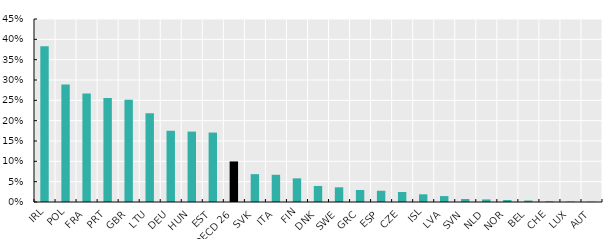
| Category | Share missing responses to mental health questions |
|---|---|
| IRL | 0.383 |
| POL | 0.289 |
| FRA | 0.267 |
| PRT | 0.256 |
| GBR | 0.251 |
| LTU | 0.218 |
| DEU | 0.175 |
| HUN | 0.173 |
| EST | 0.171 |
| OECD 26 | 0.1 |
| SVK | 0.069 |
| ITA | 0.067 |
| FIN | 0.058 |
| DNK | 0.039 |
| SWE | 0.036 |
| GRC | 0.03 |
| ESP | 0.028 |
| CZE | 0.025 |
| ISL | 0.019 |
| LVA | 0.015 |
| SVN | 0.007 |
| NLD | 0.006 |
| NOR | 0.005 |
| BEL | 0.004 |
| CHE | 0.002 |
| LUX | 0.001 |
| AUT | 0.001 |